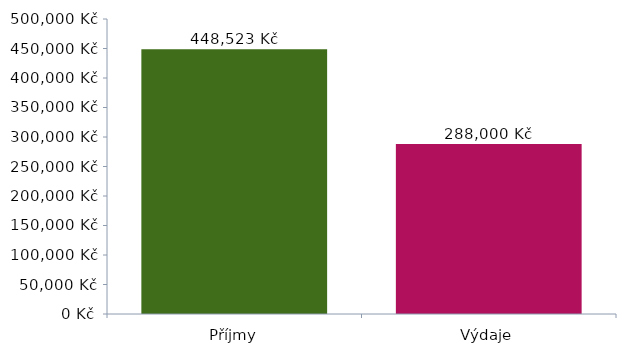
| Category | DataGrafu |
|---|---|
| 0 | 448523 |
| 1 | 288000 |